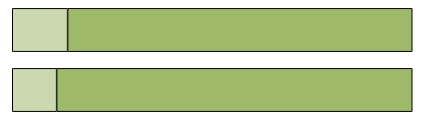
| Category | Series 0 | Series 1 |
|---|---|---|
| 0 | 144302 | 1155683 |
| 1 | 219266 | 1364773 |